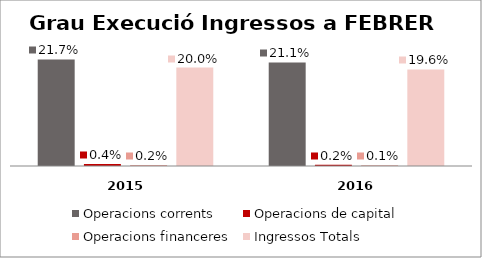
| Category | Operacions corrents | Operacions de capital | Operacions financeres | Ingressos Totals |
|---|---|---|---|---|
| 0 | 0.217 | 0.004 | 0.002 | 0.2 |
| 1 | 0.211 | 0.002 | 0.001 | 0.196 |